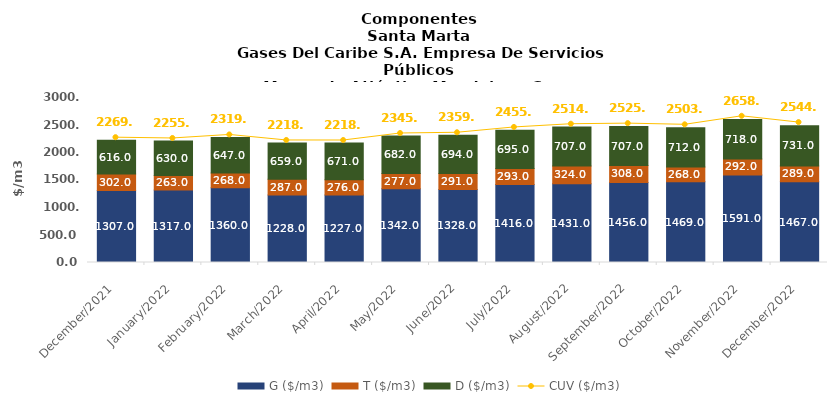
| Category | G ($/m3) | T ($/m3) | D ($/m3) |
|---|---|---|---|
| 2021-12-01 | 1307 | 302 | 616 |
| 2022-01-01 | 1317 | 263 | 630 |
| 2022-02-01 | 1360 | 268 | 647 |
| 2022-03-01 | 1228 | 287 | 659 |
| 2022-04-01 | 1227 | 276 | 671 |
| 2022-05-01 | 1342 | 277 | 682 |
| 2022-06-01 | 1328 | 291 | 694 |
| 2022-07-01 | 1416 | 293 | 695 |
| 2022-08-01 | 1431 | 324 | 707 |
| 2022-09-01 | 1456 | 308 | 707 |
| 2022-10-01 | 1469 | 268 | 712 |
| 2022-11-01 | 1591 | 292 | 718 |
| 2022-12-01 | 1467 | 289 | 731 |